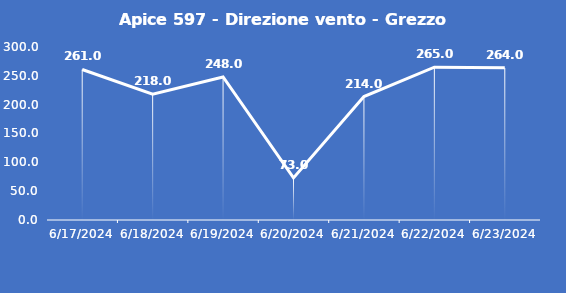
| Category | Apice 597 - Direzione vento - Grezzo (°N) |
|---|---|
| 6/17/24 | 261 |
| 6/18/24 | 218 |
| 6/19/24 | 248 |
| 6/20/24 | 73 |
| 6/21/24 | 214 |
| 6/22/24 | 265 |
| 6/23/24 | 264 |